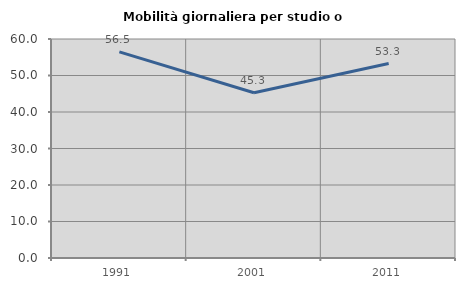
| Category | Mobilità giornaliera per studio o lavoro |
|---|---|
| 1991.0 | 56.462 |
| 2001.0 | 45.278 |
| 2011.0 | 53.288 |